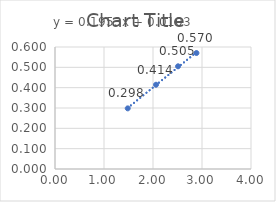
| Category | Series 0 |
|---|---|
| 1.4843 | 0.298 |
| 2.0614666666666666 | 0.414 |
| 2.511133333333333 | 0.505 |
| 2.886633333333333 | 0.57 |